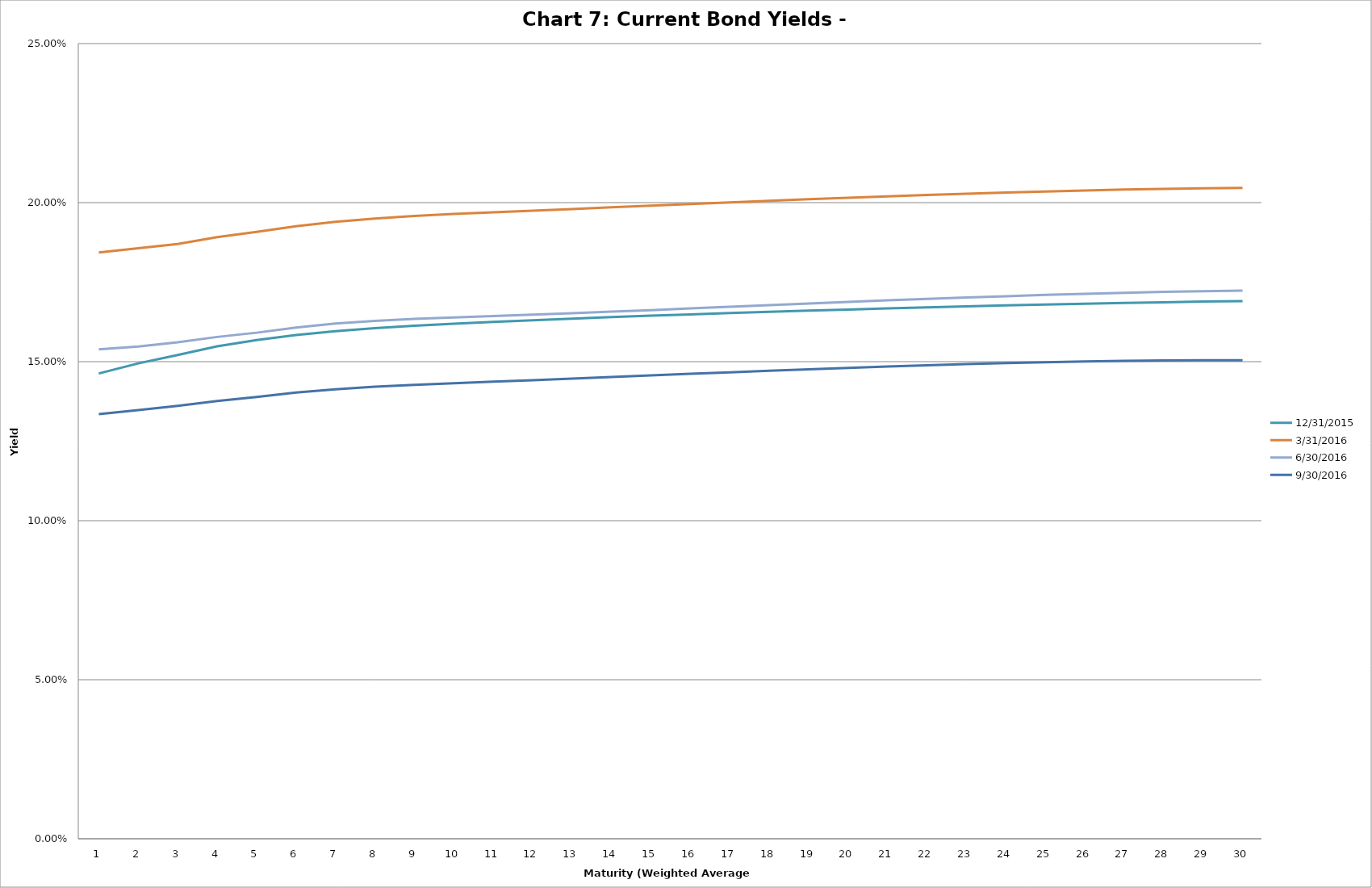
| Category | 12/31/2015 | 3/31/2016 | 6/30/2016 | 9/30/2016 |
|---|---|---|---|---|
| 0 | 0.146 | 0.184 | 0.154 | 0.134 |
| 1 | 0.149 | 0.186 | 0.155 | 0.135 |
| 2 | 0.152 | 0.187 | 0.156 | 0.136 |
| 3 | 0.155 | 0.189 | 0.158 | 0.138 |
| 4 | 0.157 | 0.191 | 0.159 | 0.139 |
| 5 | 0.158 | 0.193 | 0.161 | 0.14 |
| 6 | 0.16 | 0.194 | 0.162 | 0.141 |
| 7 | 0.161 | 0.195 | 0.163 | 0.142 |
| 8 | 0.161 | 0.196 | 0.163 | 0.143 |
| 9 | 0.162 | 0.196 | 0.164 | 0.143 |
| 10 | 0.163 | 0.197 | 0.164 | 0.144 |
| 11 | 0.163 | 0.197 | 0.165 | 0.144 |
| 12 | 0.164 | 0.198 | 0.165 | 0.145 |
| 13 | 0.164 | 0.199 | 0.166 | 0.145 |
| 14 | 0.164 | 0.199 | 0.166 | 0.146 |
| 15 | 0.165 | 0.2 | 0.167 | 0.146 |
| 16 | 0.165 | 0.2 | 0.167 | 0.147 |
| 17 | 0.166 | 0.201 | 0.168 | 0.147 |
| 18 | 0.166 | 0.201 | 0.168 | 0.148 |
| 19 | 0.166 | 0.202 | 0.169 | 0.148 |
| 20 | 0.167 | 0.202 | 0.169 | 0.148 |
| 21 | 0.167 | 0.202 | 0.17 | 0.149 |
| 22 | 0.167 | 0.203 | 0.17 | 0.149 |
| 23 | 0.168 | 0.203 | 0.171 | 0.15 |
| 24 | 0.168 | 0.204 | 0.171 | 0.15 |
| 25 | 0.168 | 0.204 | 0.171 | 0.15 |
| 26 | 0.168 | 0.204 | 0.172 | 0.15 |
| 27 | 0.169 | 0.204 | 0.172 | 0.15 |
| 28 | 0.169 | 0.205 | 0.172 | 0.15 |
| 29 | 0.169 | 0.205 | 0.172 | 0.15 |